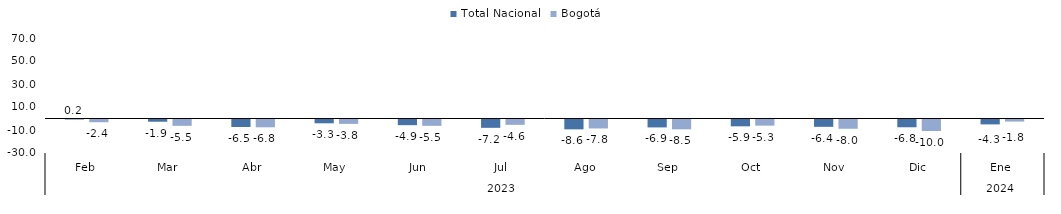
| Category | Total Nacional | Bogotá |
|---|---|---|
| 0 | 0.221 | -2.385 |
| 1 | -1.935 | -5.499 |
| 2 | -6.504 | -6.782 |
| 3 | -3.307 | -3.813 |
| 4 | -4.928 | -5.504 |
| 5 | -7.243 | -4.641 |
| 6 | -8.564 | -7.799 |
| 7 | -6.884 | -8.536 |
| 8 | -5.936 | -5.344 |
| 9 | -6.372 | -8.049 |
| 10 | -6.759 | -9.991 |
| 11 | -4.257 | -1.819 |